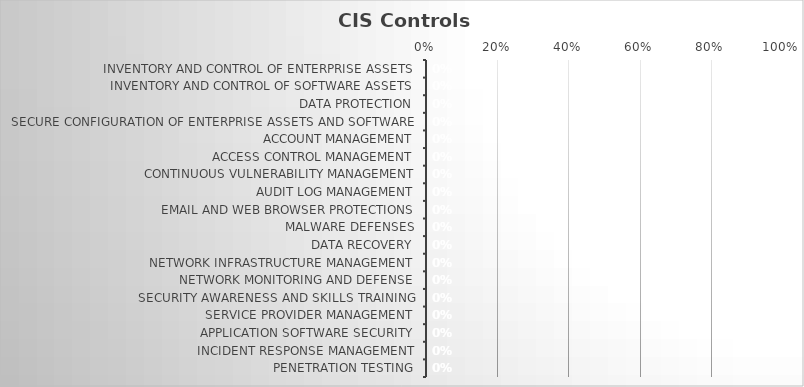
| Category | Score: |
|---|---|
| Inventory and Control of Enterprise Assets | 0 |
| Inventory and Control of Software Assets | 0 |
| Data Protection | 0 |
| Secure Configuration of Enterprise Assets and Software | 0 |
| Account Management | 0 |
| Access Control Management | 0 |
| Continuous Vulnerability Management | 0 |
| Audit Log Management | 0 |
| Email and Web Browser Protections | 0 |
| Malware Defenses | 0 |
| Data Recovery | 0 |
| Network Infrastructure Management | 0 |
| Network Monitoring and Defense | 0 |
| Security Awareness and Skills Training | 0 |
| Service Provider Management | 0 |
| Application Software Security | 0 |
| Incident Response Management | 0 |
| Penetration Testing | 0 |